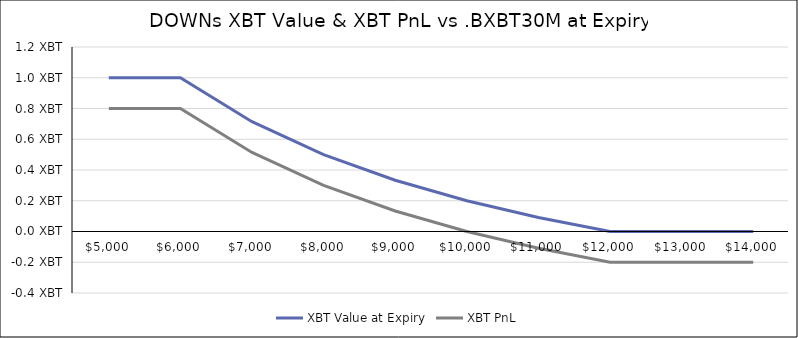
| Category | XBT Value at Expiry | XBT PnL |
|---|---|---|
| 5000.0 | 1 | 0.8 |
| 6000.0 | 1 | 0.8 |
| 7000.0 | 0.714 | 0.514 |
| 8000.0 | 0.5 | 0.3 |
| 9000.0 | 0.333 | 0.133 |
| 10000.0 | 0.2 | 0 |
| 11000.0 | 0.091 | -0.109 |
| 12000.0 | 0 | -0.2 |
| 13000.0 | 0 | -0.2 |
| 14000.0 | 0 | -0.2 |